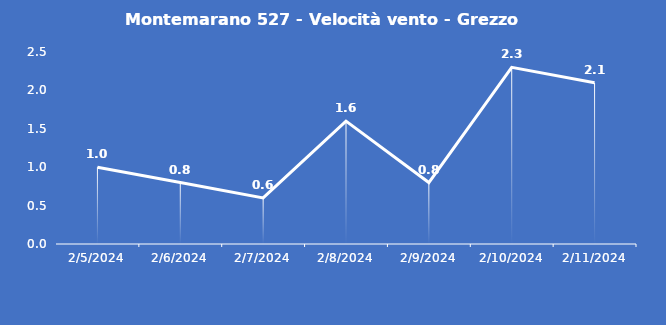
| Category | Montemarano 527 - Velocità vento - Grezzo (m/s) |
|---|---|
| 2/5/24 | 1 |
| 2/6/24 | 0.8 |
| 2/7/24 | 0.6 |
| 2/8/24 | 1.6 |
| 2/9/24 | 0.8 |
| 2/10/24 | 2.3 |
| 2/11/24 | 2.1 |